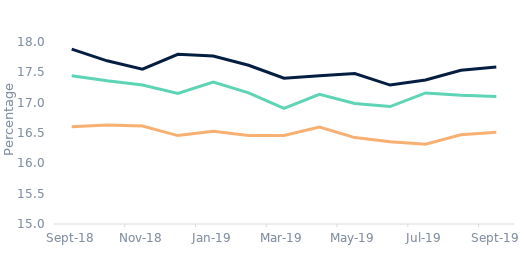
| Category | First-time
buyers | Homemovers | Remortgagors |
|---|---|---|---|
| 2018-09-01 | 17.443 | 17.883 | 16.604 |
| 2018-10-01 | 17.36 | 17.69 | 16.631 |
| 2018-11-01 | 17.29 | 17.551 | 16.616 |
| 2018-12-01 | 17.153 | 17.798 | 16.457 |
| 2019-01-01 | 17.341 | 17.77 | 16.528 |
| 2019-02-01 | 17.162 | 17.616 | 16.461 |
| 2019-03-01 | 16.904 | 17.402 | 16.46 |
| 2019-04-01 | 17.137 | 17.443 | 16.597 |
| 2019-05-01 | 16.986 | 17.481 | 16.424 |
| 2019-06-01 | 16.936 | 17.29 | 16.357 |
| 2019-07-01 | 17.161 | 17.375 | 16.315 |
| 2019-08-01 | 17.122 | 17.534 | 16.472 |
| 2019-09-01 | 17.1 | 17.589 | 16.512 |